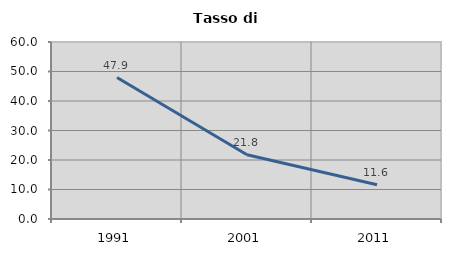
| Category | Tasso di disoccupazione   |
|---|---|
| 1991.0 | 47.942 |
| 2001.0 | 21.76 |
| 2011.0 | 11.587 |